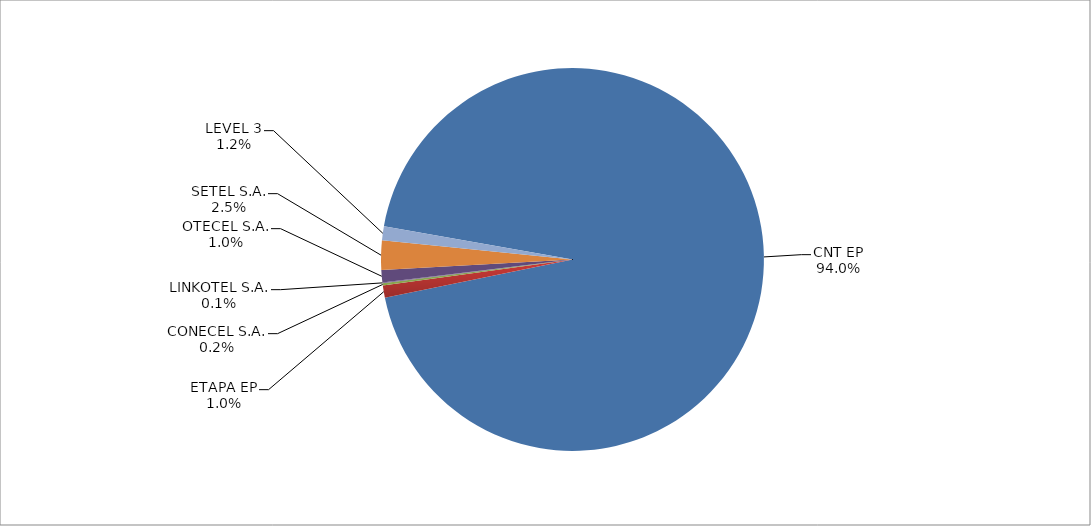
| Category | Series 0 |
|---|---|
| CNT EP | 2467 |
| ETAPA EP | 27 |
| CONECEL S.A. | 5 |
| LINKOTEL S.A. | 2 |
| OTECEL S.A. | 27 |
| SETEL S.A. | 65 |
| LEVEL 3 | 31 |